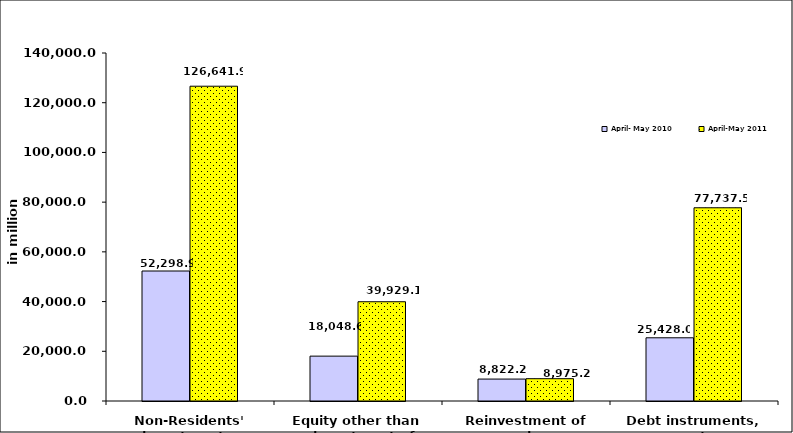
| Category | April- May 2010 | April-May 2011 |
|---|---|---|
| Non-Residents' investments 
in the Phils. | 52298.85 | 126641.876 |
| Equity other than reinvestment of earnings | 18048.629 | 39929.081 |
| Reinvestment of earnings | 8822.196 | 8975.248 |
| Debt instruments, net | 25428.025 | 77737.548 |